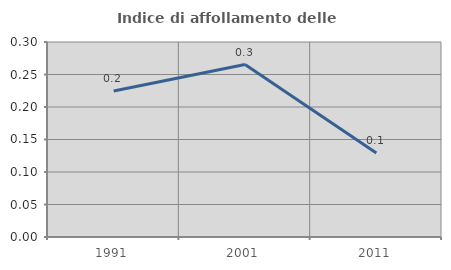
| Category | Indice di affollamento delle abitazioni  |
|---|---|
| 1991.0 | 0.225 |
| 2001.0 | 0.265 |
| 2011.0 | 0.129 |